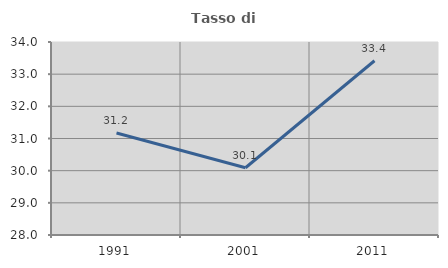
| Category | Tasso di occupazione   |
|---|---|
| 1991.0 | 31.171 |
| 2001.0 | 30.09 |
| 2011.0 | 33.417 |